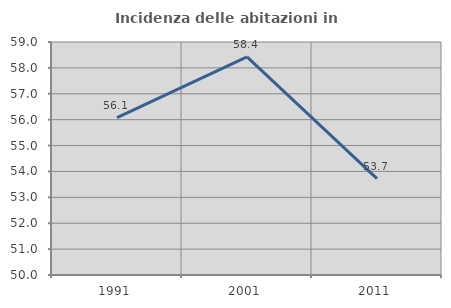
| Category | Incidenza delle abitazioni in proprietà  |
|---|---|
| 1991.0 | 56.082 |
| 2001.0 | 58.425 |
| 2011.0 | 53.719 |